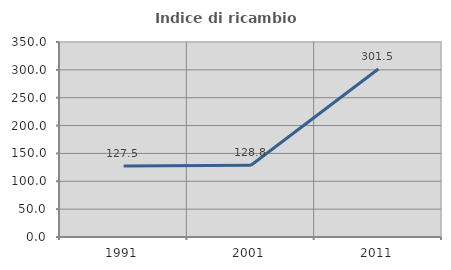
| Category | Indice di ricambio occupazionale  |
|---|---|
| 1991.0 | 127.54 |
| 2001.0 | 128.763 |
| 2011.0 | 301.504 |